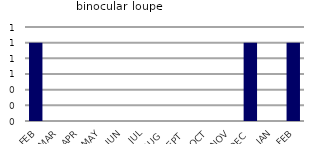
| Category | binocular loupe |
|---|---|
| FEB | 1 |
| MAR | 0 |
| APR | 0 |
| MAY | 0 |
| JUN | 0 |
| JUL | 0 |
| AUG | 0 |
| SEPT | 0 |
| OCT | 0 |
| NOV | 0 |
| DEC | 1 |
| JAN | 0 |
| FEB | 1 |